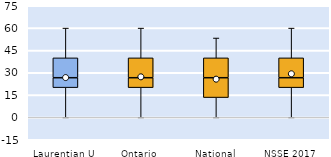
| Category | 25th | 50th | 75th |
|---|---|---|---|
| Laurentian U | 20 | 6.667 | 13.333 |
| Ontario | 20 | 6.667 | 13.333 |
| National | 13.333 | 13.333 | 13.333 |
| NSSE 2017 | 20 | 6.667 | 13.333 |